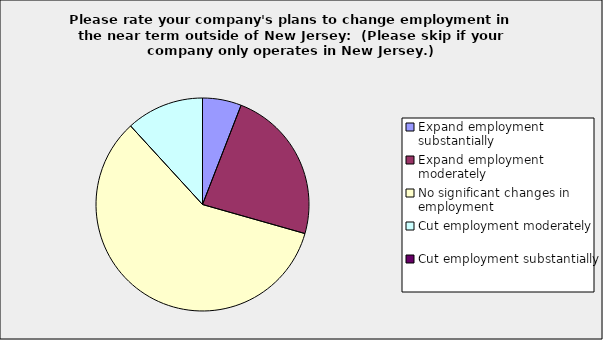
| Category | Series 0 |
|---|---|
| Expand employment substantially | 0.059 |
| Expand employment moderately | 0.235 |
| No significant changes in employment | 0.588 |
| Cut employment moderately | 0.118 |
| Cut employment substantially | 0 |